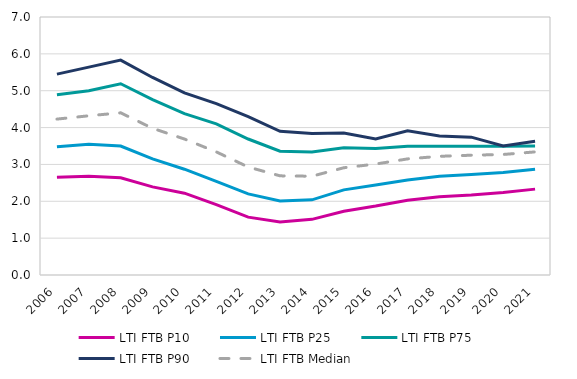
| Category | LTI FTB P10 | LTI FTB P25 | LTI FTB P75 | LTI FTB P90  | LTI FTB Median |
|---|---|---|---|---|---|
| 2006.0 | 2.65 | 3.48 | 4.89 | 5.45 | 4.23 |
| 2007.0 | 2.68 | 3.55 | 5 | 5.64 | 4.32 |
| 2008.0 | 2.64 | 3.5 | 5.19 | 5.83 | 4.4 |
| 2009.0 | 2.39 | 3.15 | 4.76 | 5.36 | 3.98 |
| 2010.0 | 2.22 | 2.87 | 4.38 | 4.94 | 3.69 |
| 2011.0 | 1.91 | 2.54 | 4.1 | 4.65 | 3.34 |
| 2012.0 | 1.57 | 2.2 | 3.69 | 4.3 | 2.93 |
| 2013.0 | 1.44 | 2.01 | 3.36 | 3.9 | 2.69 |
| 2014.0 | 1.51 | 2.04 | 3.34 | 3.84 | 2.68 |
| 2015.0 | 1.73 | 2.31 | 3.45 | 3.85 | 2.91 |
| 2016.0 | 1.87 | 2.44 | 3.43 | 3.69 | 3.01 |
| 2017.0 | 2.03 | 2.58 | 3.49 | 3.91 | 3.15 |
| 2018.0 | 2.12 | 2.68 | 3.49 | 3.77 | 3.22 |
| 2019.0 | 2.17 | 2.73 | 3.49 | 3.74 | 3.25 |
| 2020.0 | 2.24 | 2.78 | 3.49 | 3.5 | 3.27 |
| 2021.0 | 2.33 | 2.87 | 3.5 | 3.63 | 3.34 |